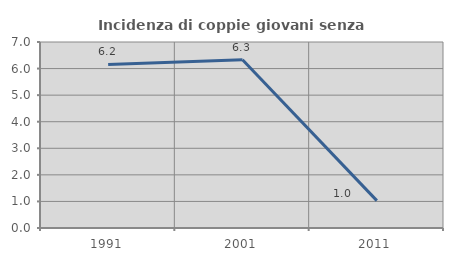
| Category | Incidenza di coppie giovani senza figli |
|---|---|
| 1991.0 | 6.154 |
| 2001.0 | 6.329 |
| 2011.0 | 1.031 |